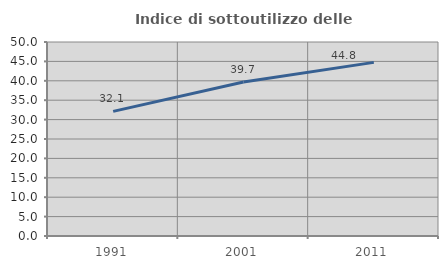
| Category | Indice di sottoutilizzo delle abitazioni  |
|---|---|
| 1991.0 | 32.122 |
| 2001.0 | 39.695 |
| 2011.0 | 44.751 |